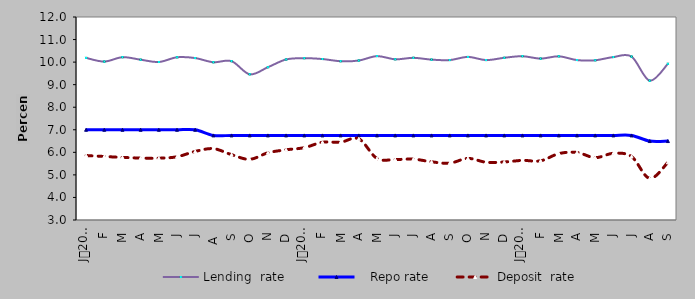
| Category | Lending  rate |    Repo rate | Deposit  rate |
|---|---|---|---|
| 0 | 10.187 | 7 | 5.858 |
| 1900-01-01 | 10.024 | 7 | 5.815 |
| 1900-01-02 | 10.218 | 7 | 5.776 |
| 1900-01-03 | 10.107 | 7 | 5.746 |
| 1900-01-04 | 10.004 | 7 | 5.74 |
| 1900-01-05 | 10.214 | 7 | 5.804 |
| 1900-01-06 | 10.18 | 7 | 6.04 |
| 1900-01-07 | 9.994 | 6.75 | 6.162 |
| 1900-01-08 | 10.042 | 6.75 | 5.898 |
| 1900-01-09 | 9.46 | 6.75 | 5.69 |
| 1900-01-10 | 9.774 | 6.75 | 5.98 |
| 1900-01-11 | 10.117 | 6.75 | 6.113 |
| 1900-01-12 | 10.174 | 6.75 | 6.207 |
| 1900-01-13 | 10.136 | 6.75 | 6.446 |
| 1900-01-14 | 10.04 | 6.75 | 6.45 |
| 1900-01-15 | 10.07 | 6.75 | 6.6 |
| 1900-01-16 | 10.265 | 6.75 | 5.728 |
| 1900-01-17 | 10.125 | 6.75 | 5.682 |
| 1900-01-18 | 10.19 | 6.75 | 5.7 |
| 1900-01-19 | 10.11 | 6.75 | 5.58 |
| 1900-01-20 | 10.09 | 6.75 | 5.52 |
| 1900-01-21 | 10.23 | 6.75 | 5.73 |
| 1900-01-22 | 10.09 | 6.75 | 5.56 |
| 1900-01-23 | 10.192 | 6.75 | 5.572 |
| 1900-01-24 | 10.261 | 6.75 | 5.643 |
| 1900-01-25 | 10.155 | 6.75 | 5.624 |
| 1900-01-26 | 10.257 | 6.75 | 5.943 |
| 1900-01-27 | 10.09 | 6.75 | 5.994 |
| 1900-01-28 | 10.081 | 6.75 | 5.764 |
| 1900-01-29 | 10.224 | 6.75 | 5.956 |
| 1900-01-30 | 10.245 | 6.75 | 5.813 |
| 1900-01-31 | 9.178 | 6.5 | 4.843 |
| 1900-02-01 | 9.925 | 6.5 | 5.555 |